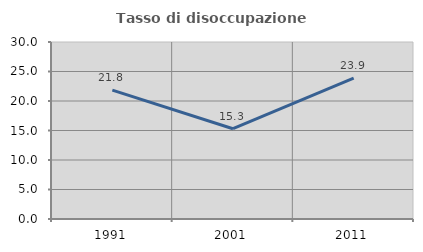
| Category | Tasso di disoccupazione giovanile  |
|---|---|
| 1991.0 | 21.845 |
| 2001.0 | 15.302 |
| 2011.0 | 23.875 |